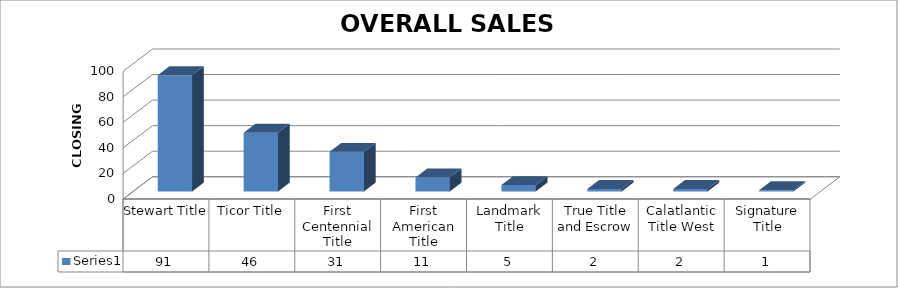
| Category | Series 0 |
|---|---|
| Stewart Title | 91 |
| Ticor Title | 46 |
| First Centennial Title | 31 |
| First American Title | 11 |
| Landmark Title | 5 |
| True Title and Escrow | 2 |
| Calatlantic Title West | 2 |
| Signature Title | 1 |